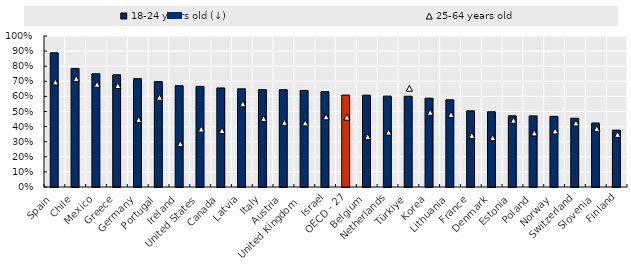
| Category | 18-24 years old (↓) |
|---|---|
| Spain | 0.889 |
| Chile | 0.785 |
| Mexico | 0.75 |
| Greece | 0.743 |
| Germany | 0.717 |
| Portugal | 0.698 |
| Ireland | 0.671 |
| United States | 0.666 |
| Canada | 0.656 |
| Latvia | 0.65 |
| Italy | 0.645 |
| Austria | 0.644 |
| United Kingdom  | 0.639 |
| Israel | 0.631 |
| OECD - 27 | 0.609 |
| Belgium | 0.608 |
| Netherlands | 0.602 |
| Türkiye | 0.601 |
| Korea | 0.588 |
| Lithuania | 0.577 |
| France | 0.504 |
| Denmark | 0.498 |
| Estonia | 0.471 |
| Poland | 0.471 |
| Norway | 0.468 |
| Switzerland | 0.455 |
| Slovenia | 0.424 |
| Finland | 0.376 |